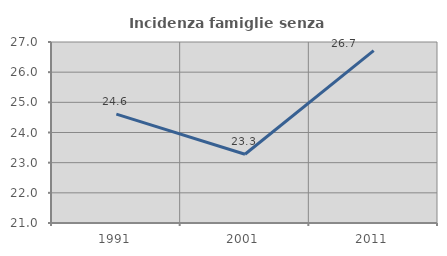
| Category | Incidenza famiglie senza nuclei |
|---|---|
| 1991.0 | 24.61 |
| 2001.0 | 23.28 |
| 2011.0 | 26.712 |